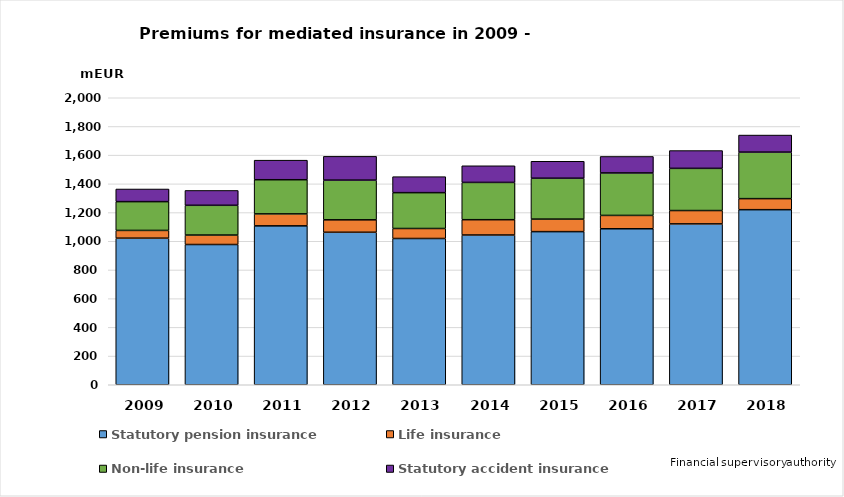
| Category | Statutory pension insurance | Life insurance | Non-life insurance | Statutory accident insurance |
|---|---|---|---|---|
| 2009.0 | 1021.457 | 54.107 | 200.56 | 88.041 |
| 2010.0 | 977.321 | 65.95 | 207.341 | 103.558 |
| 2011.0 | 1107.329 | 83.403 | 238.041 | 136.289 |
| 2012.0 | 1062.705 | 86.597 | 276.62 | 165.706 |
| 2013.0 | 1019.216 | 69.648 | 249.823 | 111.515 |
| 2014.0 | 1043.573 | 106.619 | 259.835 | 115.957 |
| 2015.0 | 1067.062 | 87.285 | 284.943 | 118.153 |
| 2016.0 | 1087 | 93 | 296 | 115 |
| 2017.0 | 1121 | 93 | 294 | 124 |
| 2018.0 | 1220 | 77 | 324 | 119 |